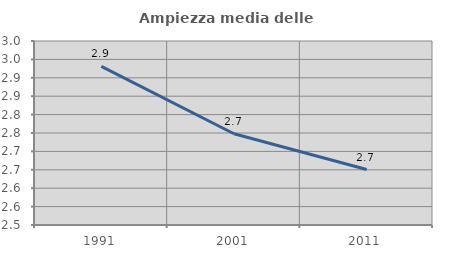
| Category | Ampiezza media delle famiglie |
|---|---|
| 1991.0 | 2.931 |
| 2001.0 | 2.748 |
| 2011.0 | 2.651 |